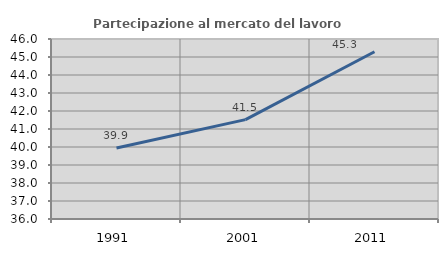
| Category | Partecipazione al mercato del lavoro  femminile |
|---|---|
| 1991.0 | 39.948 |
| 2001.0 | 41.52 |
| 2011.0 | 45.292 |